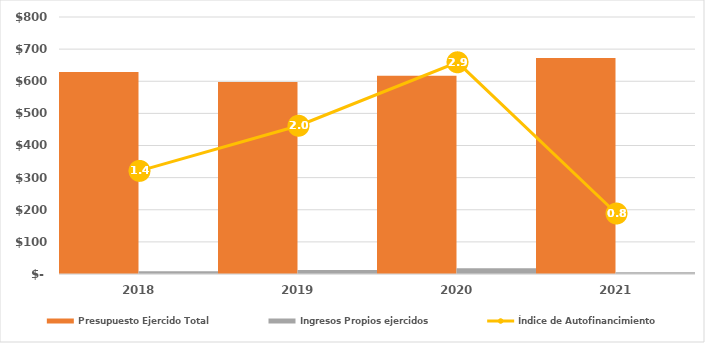
| Category | Presupuesto Ejercido Total | Ingresos Propios ejercidos |
|---|---|---|
| 2018.0 | 628799.563 | 8828.859 |
| 2019.0 | 598040.902 | 12076.572 |
| 2020.0 | 617347.742 | 17799.164 |
| 2021.0 | 672172.234 | 5535.108 |